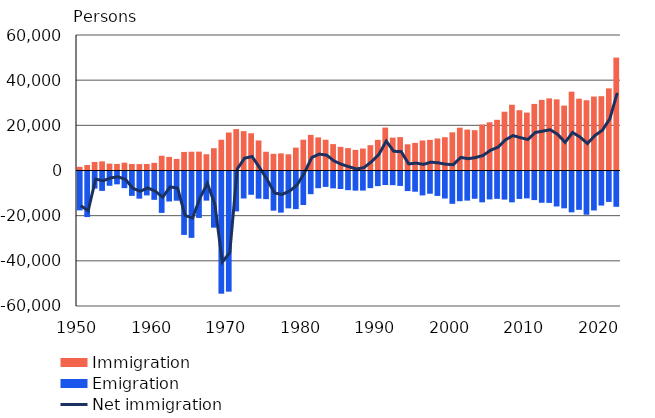
| Category | Immigration | Emigration |
|---|---|---|
| 1950.0 | 1634 | -17211 |
| 1951.0 | 2432 | -20185 |
| 1952.0 | 3787 | -7576 |
| 1953.0 | 4037 | -8597 |
| 1954.0 | 3045 | -6320 |
| 1955.0 | 2900 | -5687 |
| 1956.0 | 3457 | -7379 |
| 1957.0 | 2901 | -10787 |
| 1958.0 | 2834 | -12025 |
| 1959.0 | 2893 | -10587 |
| 1960.0 | 3396 | -12552 |
| 1961.0 | 6521 | -18336 |
| 1962.0 | 6026 | -13280 |
| 1963.0 | 5127 | -12947 |
| 1964.0 | 8214 | -28082 |
| 1965.0 | 8311 | -29394 |
| 1966.0 | 8351 | -20554 |
| 1967.0 | 7202 | -12898 |
| 1968.0 | 9872 | -24866 |
| 1969.0 | 13608 | -54107 |
| 1970.0 | 16824 | -53205 |
| 1971.0 | 18338 | -17665 |
| 1972.0 | 17421 | -11951 |
| 1973.0 | 16491 | -10309 |
| 1974.0 | 13311 | -12027 |
| 1975.0 | 8307 | -12237 |
| 1976.0 | 7387 | -17346 |
| 1977.0 | 7580 | -18209 |
| 1978.0 | 7184 | -16327 |
| 1979.0 | 10122 | -16661 |
| 1980.0 | 13626 | -14824 |
| 1981.0 | 15771 | -10042 |
| 1982.0 | 14661 | -7403 |
| 1983.0 | 13629 | -6822 |
| 1984.0 | 11686 | -7467 |
| 1985.0 | 10465 | -7739 |
| 1986.0 | 9927 | -8269 |
| 1987.0 | 9142 | -8475 |
| 1988.0 | 9720 | -8447 |
| 1989.0 | 11219 | -7374 |
| 1990.0 | 13558 | -6477 |
| 1991.0 | 19001 | -5984 |
| 1992.0 | 14554 | -6055 |
| 1993.0 | 14795 | -6405 |
| 1994.0 | 11611 | -8672 |
| 1995.0 | 12222 | -8957 |
| 1996.0 | 13294 | -10587 |
| 1997.0 | 13564 | -9854 |
| 1998.0 | 14192 | -10817 |
| 1999.0 | 14744 | -11966 |
| 2000.0 | 16895 | -14311 |
| 2001.0 | 18955 | -13153 |
| 2002.0 | 18112 | -12891 |
| 2003.0 | 17838 | -12083 |
| 2004.0 | 20333 | -13656 |
| 2005.0 | 21355 | -12369 |
| 2006.0 | 22451 | -12107 |
| 2007.0 | 26029 | -12443 |
| 2008.0 | 29114 | -13657 |
| 2009.0 | 26699 | -12151 |
| 2010.0 | 25636 | -11905 |
| 2011.0 | 29481 | -12660 |
| 2012.0 | 31278 | -13845 |
| 2013.0 | 31941 | -13893 |
| 2014.0 | 31507 | -15486 |
| 2015.0 | 28746 | -16305 |
| 2016.0 | 34905 | -18082 |
| 2017.0 | 31797 | -16973 |
| 2018.0 | 31106 | -19141 |
| 2019.0 | 32758 | -17263 |
| 2020.0 | 32898 | -15084 |
| 2021.0 | 36364 | -13459 |
| 2022.0 | 49998 | -15635 |